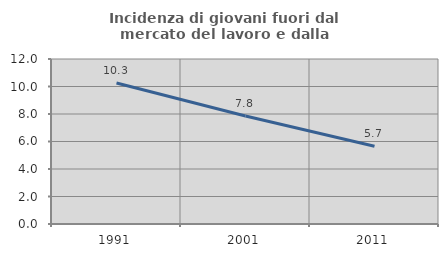
| Category | Incidenza di giovani fuori dal mercato del lavoro e dalla formazione  |
|---|---|
| 1991.0 | 10.256 |
| 2001.0 | 7.849 |
| 2011.0 | 5.66 |